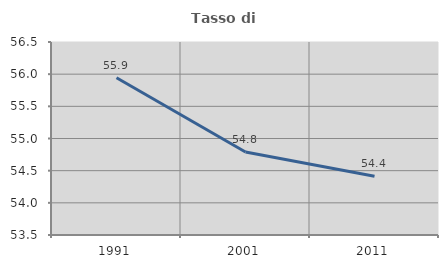
| Category | Tasso di occupazione   |
|---|---|
| 1991.0 | 55.945 |
| 2001.0 | 54.79 |
| 2011.0 | 54.412 |